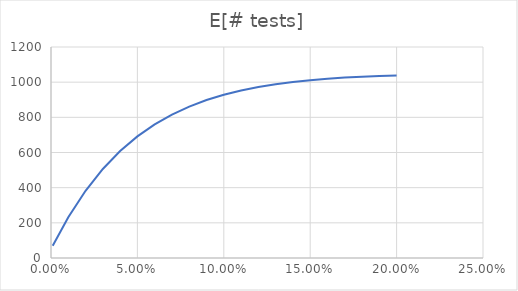
| Category | E[# tests] |
|---|---|
| 0.001 | 69.811 |
| 0.01 | 232.093 |
| 0.02 | 382.392 |
| 0.03 | 506.206 |
| 0.04 | 607.998 |
| 0.05 | 691.514 |
| 0.06 | 759.894 |
| 0.07 | 815.761 |
| 0.08 | 861.307 |
| 0.09 | 898.355 |
| 0.1 | 928.423 |
| 0.11 | 952.77 |
| 0.12 | 972.437 |
| 0.13 | 988.286 |
| 0.14 | 1001.026 |
| 0.15 | 1011.24 |
| 0.16 | 1019.41 |
| 0.17 | 1025.925 |
| 0.18 | 1031.108 |
| 0.19 | 1035.219 |
| 0.2 | 1038.471 |